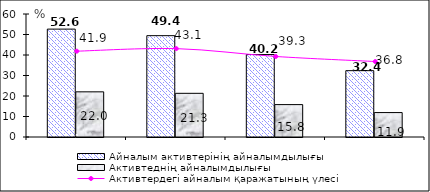
| Category | Айналым активтерінің айналымдылығы | Активтеднің айналымдылығы |
|---|---|---|
| 0 | 52.624 | 22.029 |
| 1 | 49.431 | 21.31 |
| 2 | 40.228 | 15.801 |
| 3 | 32.361 | 11.913 |